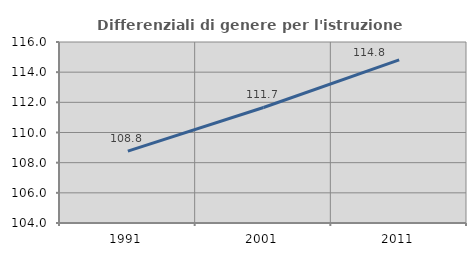
| Category | Differenziali di genere per l'istruzione superiore |
|---|---|
| 1991.0 | 108.766 |
| 2001.0 | 111.659 |
| 2011.0 | 114.816 |